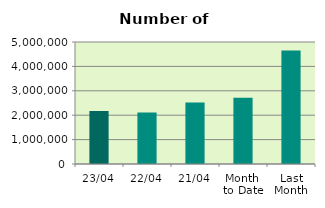
| Category | Series 0 |
|---|---|
| 23/04 | 2174776 |
| 22/04 | 2112684 |
| 21/04 | 2517112 |
| Month 
to Date | 2711332.267 |
| Last
Month | 4654844.727 |